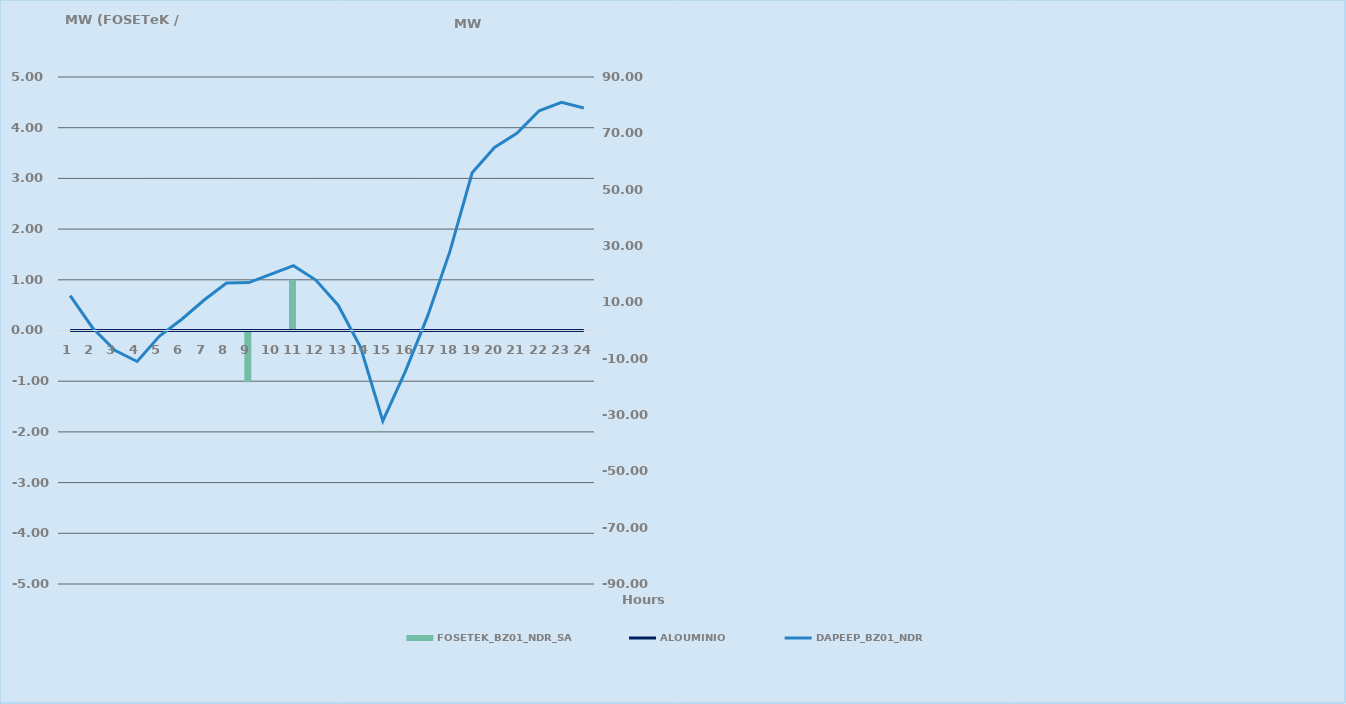
| Category | FOSETEK_BZ01_NDR_SA |
|---|---|
| 0 | 0 |
| 1 | 0 |
| 2 | 0 |
| 3 | 0 |
| 4 | 0 |
| 5 | 0 |
| 6 | 0 |
| 7 | 0 |
| 8 | -1 |
| 9 | 0 |
| 10 | 1 |
| 11 | 0 |
| 12 | 0 |
| 13 | 0 |
| 14 | 0 |
| 15 | 0 |
| 16 | 0 |
| 17 | 0 |
| 18 | 0 |
| 19 | 0 |
| 20 | 0 |
| 21 | 0 |
| 22 | 0 |
| 23 | 0 |